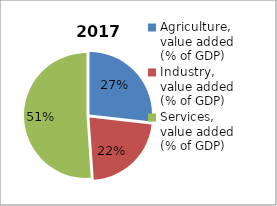
| Category | 2017 |
|---|---|
| Agriculture, value added (% of GDP)  | 26.763 |
| Industry, value added (% of GDP) | 22.142 |
| Services, value added (% of GDP) | 51.095 |